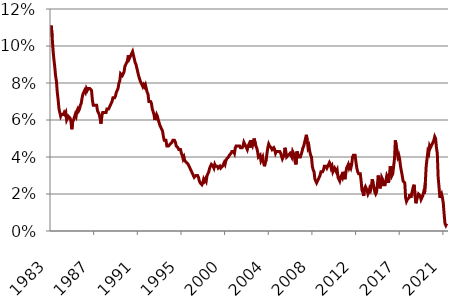
| Category | Change |
|---|---|
| 1983-01-01 | 0.11 |
| 1983-02-01 | 0.111 |
| 1983-03-01 | 0.105 |
| 1983-04-01 | 0.098 |
| 1983-05-01 | 0.093 |
| 1983-06-01 | 0.089 |
| 1983-07-01 | 0.084 |
| 1983-08-01 | 0.081 |
| 1983-09-01 | 0.075 |
| 1983-10-01 | 0.071 |
| 1983-11-01 | 0.066 |
| 1983-12-01 | 0.064 |
| 1984-01-01 | 0.062 |
| 1984-02-01 | 0.063 |
| 1984-03-01 | 0.063 |
| 1984-04-01 | 0.063 |
| 1984-05-01 | 0.064 |
| 1984-06-01 | 0.063 |
| 1984-07-01 | 0.064 |
| 1984-08-01 | 0.06 |
| 1984-09-01 | 0.061 |
| 1984-10-01 | 0.062 |
| 1984-11-01 | 0.062 |
| 1984-12-01 | 0.061 |
| 1985-01-01 | 0.059 |
| 1985-02-01 | 0.055 |
| 1985-03-01 | 0.059 |
| 1985-04-01 | 0.06 |
| 1985-05-01 | 0.06 |
| 1985-06-01 | 0.063 |
| 1985-07-01 | 0.062 |
| 1985-08-01 | 0.065 |
| 1985-09-01 | 0.066 |
| 1985-10-01 | 0.065 |
| 1985-11-01 | 0.066 |
| 1985-12-01 | 0.068 |
| 1986-01-01 | 0.069 |
| 1986-02-01 | 0.072 |
| 1986-03-01 | 0.074 |
| 1986-04-01 | 0.075 |
| 1986-05-01 | 0.076 |
| 1986-06-01 | 0.075 |
| 1986-07-01 | 0.077 |
| 1986-08-01 | 0.076 |
| 1986-09-01 | 0.077 |
| 1986-10-01 | 0.077 |
| 1986-11-01 | 0.077 |
| 1986-12-01 | 0.077 |
| 1987-01-01 | 0.076 |
| 1987-02-01 | 0.071 |
| 1987-03-01 | 0.068 |
| 1987-04-01 | 0.068 |
| 1987-05-01 | 0.068 |
| 1987-06-01 | 0.068 |
| 1987-07-01 | 0.068 |
| 1987-08-01 | 0.065 |
| 1987-09-01 | 0.064 |
| 1987-10-01 | 0.063 |
| 1987-11-01 | 0.061 |
| 1987-12-01 | 0.058 |
| 1988-01-01 | 0.062 |
| 1988-02-01 | 0.064 |
| 1988-03-01 | 0.064 |
| 1988-04-01 | 0.064 |
| 1988-05-01 | 0.064 |
| 1988-06-01 | 0.064 |
| 1988-07-01 | 0.066 |
| 1988-08-01 | 0.066 |
| 1988-09-01 | 0.066 |
| 1988-10-01 | 0.067 |
| 1988-11-01 | 0.068 |
| 1988-12-01 | 0.069 |
| 1989-01-01 | 0.07 |
| 1989-02-01 | 0.072 |
| 1989-03-01 | 0.072 |
| 1989-04-01 | 0.072 |
| 1989-05-01 | 0.073 |
| 1989-06-01 | 0.075 |
| 1989-07-01 | 0.075 |
| 1989-08-01 | 0.077 |
| 1989-09-01 | 0.08 |
| 1989-10-01 | 0.081 |
| 1989-11-01 | 0.085 |
| 1989-12-01 | 0.085 |
| 1990-01-01 | 0.084 |
| 1990-02-01 | 0.085 |
| 1990-03-01 | 0.086 |
| 1990-04-01 | 0.089 |
| 1990-05-01 | 0.09 |
| 1990-06-01 | 0.09 |
| 1990-07-01 | 0.092 |
| 1990-08-01 | 0.095 |
| 1990-09-01 | 0.093 |
| 1990-10-01 | 0.094 |
| 1990-11-01 | 0.094 |
| 1990-12-01 | 0.096 |
| 1991-01-01 | 0.097 |
| 1991-02-01 | 0.095 |
| 1991-03-01 | 0.095 |
| 1991-04-01 | 0.091 |
| 1991-05-01 | 0.09 |
| 1991-06-01 | 0.088 |
| 1991-07-01 | 0.086 |
| 1991-08-01 | 0.084 |
| 1991-09-01 | 0.084 |
| 1991-10-01 | 0.081 |
| 1991-11-01 | 0.08 |
| 1991-12-01 | 0.079 |
| 1992-01-01 | 0.078 |
| 1992-02-01 | 0.079 |
| 1992-03-01 | 0.078 |
| 1992-04-01 | 0.079 |
| 1992-05-01 | 0.077 |
| 1992-06-01 | 0.075 |
| 1992-07-01 | 0.074 |
| 1992-08-01 | 0.07 |
| 1992-09-01 | 0.07 |
| 1992-10-01 | 0.07 |
| 1992-11-01 | 0.069 |
| 1992-12-01 | 0.066 |
| 1993-01-01 | 0.066 |
| 1993-02-01 | 0.063 |
| 1993-03-01 | 0.06 |
| 1993-04-01 | 0.06 |
| 1993-05-01 | 0.063 |
| 1993-06-01 | 0.062 |
| 1993-07-01 | 0.06 |
| 1993-08-01 | 0.06 |
| 1993-09-01 | 0.057 |
| 1993-10-01 | 0.057 |
| 1993-11-01 | 0.055 |
| 1993-12-01 | 0.054 |
| 1994-01-01 | 0.051 |
| 1994-02-01 | 0.049 |
| 1994-03-01 | 0.049 |
| 1994-04-01 | 0.049 |
| 1994-05-01 | 0.046 |
| 1994-06-01 | 0.046 |
| 1994-07-01 | 0.046 |
| 1994-08-01 | 0.046 |
| 1994-09-01 | 0.047 |
| 1994-10-01 | 0.047 |
| 1994-11-01 | 0.048 |
| 1994-12-01 | 0.049 |
| 1995-01-01 | 0.049 |
| 1995-02-01 | 0.049 |
| 1995-03-01 | 0.048 |
| 1995-04-01 | 0.046 |
| 1995-05-01 | 0.046 |
| 1995-06-01 | 0.045 |
| 1995-07-01 | 0.044 |
| 1995-08-01 | 0.044 |
| 1995-09-01 | 0.044 |
| 1995-10-01 | 0.042 |
| 1995-11-01 | 0.041 |
| 1995-12-01 | 0.039 |
| 1996-01-01 | 0.04 |
| 1996-02-01 | 0.038 |
| 1996-03-01 | 0.038 |
| 1996-04-01 | 0.037 |
| 1996-05-01 | 0.037 |
| 1996-06-01 | 0.036 |
| 1996-07-01 | 0.036 |
| 1996-08-01 | 0.034 |
| 1996-09-01 | 0.033 |
| 1996-10-01 | 0.032 |
| 1996-11-01 | 0.031 |
| 1996-12-01 | 0.03 |
| 1997-01-01 | 0.029 |
| 1997-02-01 | 0.029 |
| 1997-03-01 | 0.03 |
| 1997-04-01 | 0.03 |
| 1997-05-01 | 0.03 |
| 1997-06-01 | 0.029 |
| 1997-07-01 | 0.027 |
| 1997-08-01 | 0.026 |
| 1997-09-01 | 0.026 |
| 1997-10-01 | 0.025 |
| 1997-11-01 | 0.026 |
| 1997-12-01 | 0.028 |
| 1998-01-01 | 0.027 |
| 1998-02-01 | 0.028 |
| 1998-03-01 | 0.027 |
| 1998-04-01 | 0.03 |
| 1998-05-01 | 0.031 |
| 1998-06-01 | 0.032 |
| 1998-07-01 | 0.034 |
| 1998-08-01 | 0.035 |
| 1998-09-01 | 0.036 |
| 1998-10-01 | 0.036 |
| 1998-11-01 | 0.035 |
| 1998-12-01 | 0.034 |
| 1999-01-01 | 0.036 |
| 1999-02-01 | 0.035 |
| 1999-03-01 | 0.035 |
| 1999-04-01 | 0.035 |
| 1999-05-01 | 0.034 |
| 1999-06-01 | 0.034 |
| 1999-07-01 | 0.035 |
| 1999-08-01 | 0.034 |
| 1999-09-01 | 0.034 |
| 1999-10-01 | 0.035 |
| 1999-11-01 | 0.035 |
| 1999-12-01 | 0.037 |
| 2000-01-01 | 0.036 |
| 2000-02-01 | 0.038 |
| 2000-03-01 | 0.039 |
| 2000-04-01 | 0.039 |
| 2000-05-01 | 0.04 |
| 2000-06-01 | 0.041 |
| 2000-07-01 | 0.041 |
| 2000-08-01 | 0.042 |
| 2000-09-01 | 0.043 |
| 2000-10-01 | 0.043 |
| 2000-11-01 | 0.043 |
| 2000-12-01 | 0.042 |
| 2001-01-01 | 0.045 |
| 2001-02-01 | 0.046 |
| 2001-03-01 | 0.046 |
| 2001-04-01 | 0.046 |
| 2001-05-01 | 0.046 |
| 2001-06-01 | 0.046 |
| 2001-07-01 | 0.045 |
| 2001-08-01 | 0.045 |
| 2001-09-01 | 0.045 |
| 2001-10-01 | 0.046 |
| 2001-11-01 | 0.048 |
| 2001-12-01 | 0.047 |
| 2002-01-01 | 0.047 |
| 2002-02-01 | 0.045 |
| 2002-03-01 | 0.044 |
| 2002-04-01 | 0.046 |
| 2002-05-01 | 0.047 |
| 2002-06-01 | 0.045 |
| 2002-07-01 | 0.049 |
| 2002-08-01 | 0.047 |
| 2002-09-01 | 0.046 |
| 2002-10-01 | 0.048 |
| 2002-11-01 | 0.05 |
| 2002-12-01 | 0.05 |
| 2003-01-01 | 0.046 |
| 2003-02-01 | 0.045 |
| 2003-03-01 | 0.043 |
| 2003-04-01 | 0.04 |
| 2003-05-01 | 0.04 |
| 2003-06-01 | 0.041 |
| 2003-07-01 | 0.038 |
| 2003-08-01 | 0.039 |
| 2003-09-01 | 0.04 |
| 2003-10-01 | 0.037 |
| 2003-11-01 | 0.035 |
| 2003-12-01 | 0.037 |
| 2004-01-01 | 0.038 |
| 2004-02-01 | 0.042 |
| 2004-03-01 | 0.045 |
| 2004-04-01 | 0.047 |
| 2004-05-01 | 0.046 |
| 2004-06-01 | 0.046 |
| 2004-07-01 | 0.045 |
| 2004-08-01 | 0.044 |
| 2004-09-01 | 0.044 |
| 2004-10-01 | 0.045 |
| 2004-11-01 | 0.044 |
| 2004-12-01 | 0.042 |
| 2005-01-01 | 0.043 |
| 2005-02-01 | 0.043 |
| 2005-03-01 | 0.043 |
| 2005-04-01 | 0.043 |
| 2005-05-01 | 0.043 |
| 2005-06-01 | 0.042 |
| 2005-07-01 | 0.042 |
| 2005-08-01 | 0.039 |
| 2005-09-01 | 0.039 |
| 2005-10-01 | 0.041 |
| 2005-11-01 | 0.045 |
| 2005-12-01 | 0.043 |
| 2006-01-01 | 0.04 |
| 2006-02-01 | 0.04 |
| 2006-03-01 | 0.041 |
| 2006-04-01 | 0.041 |
| 2006-05-01 | 0.042 |
| 2006-06-01 | 0.041 |
| 2006-07-01 | 0.04 |
| 2006-08-01 | 0.043 |
| 2006-09-01 | 0.042 |
| 2006-10-01 | 0.04 |
| 2006-11-01 | 0.037 |
| 2006-12-01 | 0.036 |
| 2007-01-01 | 0.043 |
| 2007-02-01 | 0.043 |
| 2007-03-01 | 0.04 |
| 2007-04-01 | 0.04 |
| 2007-05-01 | 0.04 |
| 2007-06-01 | 0.04 |
| 2007-07-01 | 0.043 |
| 2007-08-01 | 0.045 |
| 2007-09-01 | 0.046 |
| 2007-10-01 | 0.048 |
| 2007-11-01 | 0.05 |
| 2007-12-01 | 0.052 |
| 2008-01-01 | 0.049 |
| 2008-02-01 | 0.045 |
| 2008-03-01 | 0.046 |
| 2008-04-01 | 0.043 |
| 2008-05-01 | 0.041 |
| 2008-06-01 | 0.04 |
| 2008-07-01 | 0.035 |
| 2008-08-01 | 0.033 |
| 2008-09-01 | 0.032 |
| 2008-10-01 | 0.028 |
| 2008-11-01 | 0.027 |
| 2008-12-01 | 0.026 |
| 2009-01-01 | 0.026 |
| 2009-02-01 | 0.028 |
| 2009-03-01 | 0.028 |
| 2009-04-01 | 0.03 |
| 2009-05-01 | 0.032 |
| 2009-06-01 | 0.032 |
| 2009-07-01 | 0.032 |
| 2009-08-01 | 0.033 |
| 2009-09-01 | 0.035 |
| 2009-10-01 | 0.035 |
| 2009-11-01 | 0.035 |
| 2009-12-01 | 0.034 |
| 2010-01-01 | 0.035 |
| 2010-02-01 | 0.036 |
| 2010-03-01 | 0.037 |
| 2010-04-01 | 0.036 |
| 2010-05-01 | 0.034 |
| 2010-06-01 | 0.035 |
| 2010-07-01 | 0.032 |
| 2010-08-01 | 0.032 |
| 2010-09-01 | 0.034 |
| 2010-10-01 | 0.034 |
| 2010-11-01 | 0.032 |
| 2010-12-01 | 0.033 |
| 2011-01-01 | 0.029 |
| 2011-02-01 | 0.029 |
| 2011-03-01 | 0.027 |
| 2011-04-01 | 0.029 |
| 2011-05-01 | 0.03 |
| 2011-06-01 | 0.029 |
| 2011-07-01 | 0.032 |
| 2011-08-01 | 0.032 |
| 2011-09-01 | 0.028 |
| 2011-10-01 | 0.031 |
| 2011-11-01 | 0.034 |
| 2011-12-01 | 0.035 |
| 2012-01-01 | 0.036 |
| 2012-02-01 | 0.034 |
| 2012-03-01 | 0.035 |
| 2012-04-01 | 0.034 |
| 2012-05-01 | 0.036 |
| 2012-06-01 | 0.04 |
| 2012-07-01 | 0.041 |
| 2012-08-01 | 0.041 |
| 2012-09-01 | 0.041 |
| 2012-10-01 | 0.037 |
| 2012-11-01 | 0.034 |
| 2012-12-01 | 0.032 |
| 2013-01-01 | 0.031 |
| 2013-02-01 | 0.031 |
| 2013-03-01 | 0.031 |
| 2013-04-01 | 0.027 |
| 2013-05-01 | 0.022 |
| 2013-06-01 | 0.021 |
| 2013-07-01 | 0.019 |
| 2013-08-01 | 0.023 |
| 2013-09-01 | 0.024 |
| 2013-10-01 | 0.023 |
| 2013-11-01 | 0.022 |
| 2013-12-01 | 0.02 |
| 2014-01-01 | 0.021 |
| 2014-02-01 | 0.023 |
| 2014-03-01 | 0.022 |
| 2014-04-01 | 0.024 |
| 2014-05-01 | 0.028 |
| 2014-06-01 | 0.026 |
| 2014-07-01 | 0.026 |
| 2014-08-01 | 0.021 |
| 2014-09-01 | 0.02 |
| 2014-10-01 | 0.021 |
| 2014-11-01 | 0.025 |
| 2014-12-01 | 0.03 |
| 2015-01-01 | 0.026 |
| 2015-02-01 | 0.023 |
| 2015-03-01 | 0.025 |
| 2015-04-01 | 0.029 |
| 2015-05-01 | 0.028 |
| 2015-06-01 | 0.025 |
| 2015-07-01 | 0.025 |
| 2015-08-01 | 0.025 |
| 2015-09-01 | 0.025 |
| 2015-10-01 | 0.03 |
| 2015-11-01 | 0.029 |
| 2015-12-01 | 0.026 |
| 2016-01-01 | 0.03 |
| 2016-02-01 | 0.035 |
| 2016-03-01 | 0.033 |
| 2016-04-01 | 0.03 |
| 2016-05-01 | 0.031 |
| 2016-06-01 | 0.035 |
| 2016-07-01 | 0.039 |
| 2016-08-01 | 0.049 |
| 2016-09-01 | 0.049 |
| 2016-10-01 | 0.043 |
| 2016-11-01 | 0.04 |
| 2016-12-01 | 0.041 |
| 2017-01-01 | 0.039 |
| 2017-02-01 | 0.035 |
| 2017-03-01 | 0.035 |
| 2017-04-01 | 0.03 |
| 2017-05-01 | 0.027 |
| 2017-06-01 | 0.027 |
| 2017-07-01 | 0.026 |
| 2017-08-01 | 0.018 |
| 2017-09-01 | 0.016 |
| 2017-10-01 | 0.017 |
| 2017-11-01 | 0.017 |
| 2017-12-01 | 0.018 |
| 2018-01-01 | 0.02 |
| 2018-02-01 | 0.018 |
| 2018-03-01 | 0.02 |
| 2018-04-01 | 0.022 |
| 2018-05-01 | 0.024 |
| 2018-06-01 | 0.025 |
| 2018-07-01 | 0.019 |
| 2018-08-01 | 0.015 |
| 2018-09-01 | 0.017 |
| 2018-10-01 | 0.017 |
| 2018-11-01 | 0.02 |
| 2018-12-01 | 0.02 |
| 2019-01-01 | 0.019 |
| 2019-02-01 | 0.017 |
| 2019-03-01 | 0.017 |
| 2019-04-01 | 0.019 |
| 2019-05-01 | 0.021 |
| 2019-06-01 | 0.02 |
| 2019-07-01 | 0.026 |
| 2019-08-01 | 0.035 |
| 2019-09-01 | 0.035 |
| 2019-10-01 | 0.043 |
| 2019-11-01 | 0.042 |
| 2019-12-01 | 0.046 |
| 2020-01-01 | 0.045 |
| 2020-02-01 | 0.046 |
| 2020-03-01 | 0.047 |
| 2020-04-01 | 0.048 |
| 2020-05-01 | 0.049 |
| 2020-06-01 | 0.051 |
| 2020-07-01 | 0.05 |
| 2020-08-01 | 0.045 |
| 2020-09-01 | 0.042 |
| 2020-10-01 | 0.029 |
| 2020-11-01 | 0.024 |
| 2020-12-01 | 0.018 |
| 2021-01-01 | 0.019 |
| 2021-02-01 | 0.02 |
| 2021-03-01 | 0.018 |
| 2021-04-01 | 0.015 |
| 2021-05-01 | 0.009 |
| 2021-06-01 | 0.004 |
| 2021-07-01 | 0.003 |
| 2021-08-01 | 0.004 |
| 2021-09-01 | 0.004 |